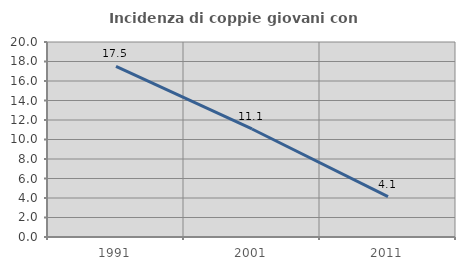
| Category | Incidenza di coppie giovani con figli |
|---|---|
| 1991.0 | 17.507 |
| 2001.0 | 11.079 |
| 2011.0 | 4.144 |